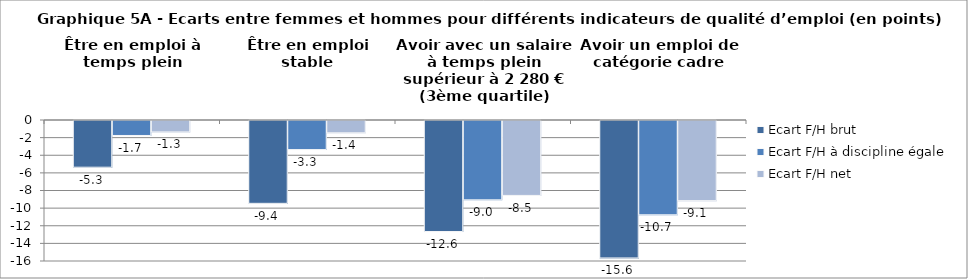
| Category | Ecart F/H brut | Ecart F/H à discipline égale | Ecart F/H net |
|---|---|---|---|
| Être en emploi à temps plein | -5.3 | -1.7 | -1.3 |
| Être en emploi stable | -9.4 | -3.3 | -1.4 |
| Avoir avec un salaire à temps plein supérieur à 2 280 € (3ème quartile) | -12.6 | -9 | -8.5 |
| Avoir un emploi de catégorie cadre | -15.6 | -10.7 | -9.1 |